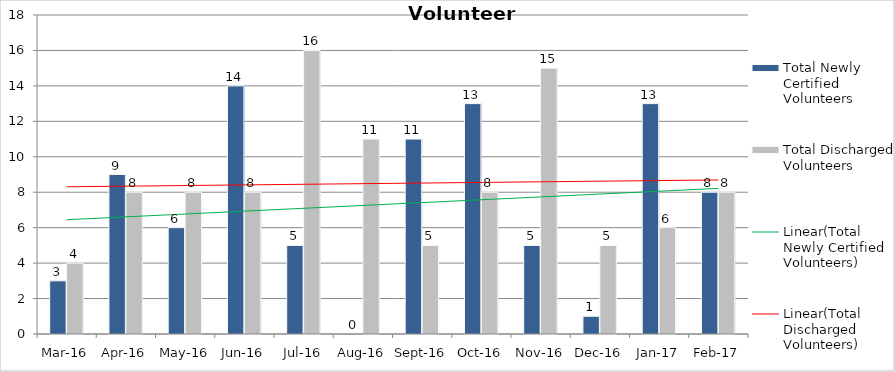
| Category | Total Newly Certified Volunteers | Total Discharged Volunteers |
|---|---|---|
| Mar-16 | 3 | 4 |
| Apr-16 | 9 | 8 |
| May-16 | 6 | 8 |
| Jun-16 | 14 | 8 |
| Jul-16 | 5 | 16 |
| Aug-16 | 0 | 11 |
| Sep-16 | 11 | 5 |
| Oct-16 | 13 | 8 |
| Nov-16 | 5 | 15 |
| Dec-16 | 1 | 5 |
| Jan-17 | 13 | 6 |
| Feb-17 | 8 | 8 |